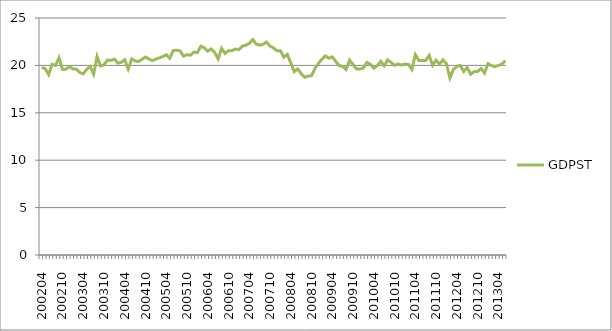
| Category | GDPST |
|---|---|
| 200204.0 | 19.788 |
| 200205.0 | 19.663 |
| 200206.0 | 19.029 |
| 200207.0 | 20.111 |
| 200208.0 | 19.997 |
| 200209.0 | 20.8 |
| 200210.0 | 19.58 |
| 200211.0 | 19.591 |
| 200212.0 | 19.879 |
| 200301.0 | 19.636 |
| 200302.0 | 19.602 |
| 200303.0 | 19.245 |
| 200304.0 | 19.105 |
| 200305.0 | 19.585 |
| 200306.0 | 19.882 |
| 200307.0 | 19.078 |
| 200308.0 | 20.943 |
| 200309.0 | 19.941 |
| 200310.0 | 20.07 |
| 200311.0 | 20.563 |
| 200312.0 | 20.526 |
| 200401.0 | 20.661 |
| 200402.0 | 20.244 |
| 200403.0 | 20.331 |
| 200404.0 | 20.598 |
| 200405.0 | 19.608 |
| 200406.0 | 20.694 |
| 200407.0 | 20.471 |
| 200408.0 | 20.403 |
| 200409.0 | 20.639 |
| 200410.0 | 20.891 |
| 200411.0 | 20.664 |
| 200412.0 | 20.508 |
| 200501.0 | 20.658 |
| 200502.0 | 20.786 |
| 200503.0 | 20.928 |
| 200504.0 | 21.117 |
| 200505.0 | 20.75 |
| 200506.0 | 21.563 |
| 200507.0 | 21.606 |
| 200508.0 | 21.524 |
| 200509.0 | 20.982 |
| 200510.0 | 21.131 |
| 200511.0 | 21.079 |
| 200512.0 | 21.401 |
| 200601.0 | 21.355 |
| 200602.0 | 22.032 |
| 200603.0 | 21.859 |
| 200604.0 | 21.498 |
| 200605.0 | 21.742 |
| 200606.0 | 21.364 |
| 200607.0 | 20.692 |
| 200608.0 | 21.796 |
| 200609.0 | 21.261 |
| 200610.0 | 21.558 |
| 200611.0 | 21.556 |
| 200612.0 | 21.721 |
| 200701.0 | 21.668 |
| 200702.0 | 22.023 |
| 200703.0 | 22.131 |
| 200704.0 | 22.318 |
| 200705.0 | 22.73 |
| 200706.0 | 22.251 |
| 200707.0 | 22.138 |
| 200708.0 | 22.228 |
| 200709.0 | 22.457 |
| 200710.0 | 22.035 |
| 200711.0 | 21.851 |
| 200712.0 | 21.537 |
| 200801.0 | 21.553 |
| 200802.0 | 20.86 |
| 200803.0 | 21.164 |
| 200804.0 | 20.271 |
| 200805.0 | 19.351 |
| 200806.0 | 19.628 |
| 200807.0 | 19.132 |
| 200808.0 | 18.751 |
| 200809.0 | 18.875 |
| 200810.0 | 18.914 |
| 200811.0 | 19.679 |
| 200812.0 | 20.227 |
| 200901.0 | 20.65 |
| 200902.0 | 21.016 |
| 200903.0 | 20.748 |
| 200904.0 | 20.896 |
| 200905.0 | 20.416 |
| 200906.0 | 19.971 |
| 200907.0 | 19.896 |
| 200908.0 | 19.564 |
| 200909.0 | 20.556 |
| 200910.0 | 20.096 |
| 200911.0 | 19.615 |
| 200912.0 | 19.614 |
| 201001.0 | 19.747 |
| 201002.0 | 20.316 |
| 201003.0 | 20.111 |
| 201004.0 | 19.709 |
| 201005.0 | 19.974 |
| 201006.0 | 20.434 |
| 201007.0 | 19.96 |
| 201008.0 | 20.581 |
| 201009.0 | 20.314 |
| 201010.0 | 20.008 |
| 201011.0 | 20.156 |
| 201012.0 | 20.034 |
| 201101.0 | 20.137 |
| 201102.0 | 20.106 |
| 201103.0 | 19.586 |
| 201104.0 | 21.13 |
| 201105.0 | 20.522 |
| 201106.0 | 20.508 |
| 201107.0 | 20.514 |
| 201108.0 | 21.055 |
| 201109.0 | 20.009 |
| 201110.0 | 20.546 |
| 201111.0 | 20.14 |
| 201112.0 | 20.586 |
| 201201.0 | 20.16 |
| 201202.0 | 18.678 |
| 201203.0 | 19.574 |
| 201204.0 | 19.906 |
| 201205.0 | 19.993 |
| 201206.0 | 19.365 |
| 201207.0 | 19.776 |
| 201208.0 | 19.069 |
| 201209.0 | 19.342 |
| 201210.0 | 19.352 |
| 201211.0 | 19.672 |
| 201212.0 | 19.194 |
| 201301.0 | 20.181 |
| 201302.0 | 19.984 |
| 201303.0 | 19.86 |
| 201304.0 | 19.994 |
| 201305.0 | 20.113 |
| 201306.0 | 20.51 |